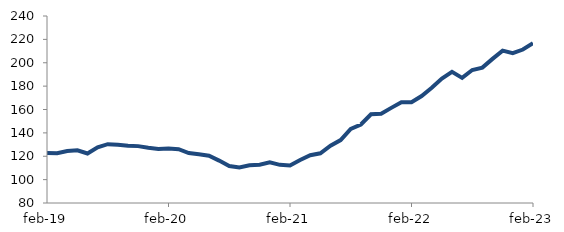
| Category | Series 0 |
|---|---|
| 2019-02-01 | 122.792 |
| 2019-03-01 | 122.605 |
| 2019-04-01 | 124.541 |
| 2019-05-01 | 125.115 |
| 2019-06-01 | 122.365 |
| 2019-07-01 | 127.653 |
| 2019-08-01 | 130.323 |
| 2019-09-01 | 129.814 |
| 2019-10-01 | 129.013 |
| 2019-11-01 | 128.663 |
| 2019-12-01 | 127.192 |
| 2020-01-01 | 126.144 |
| 2020-02-01 | 126.638 |
| 2020-03-01 | 125.992 |
| 2020-04-01 | 122.726 |
| 2020-05-01 | 121.669 |
| 2020-06-01 | 120.485 |
| 2020-07-01 | 116.268 |
| 2020-08-01 | 111.597 |
| 2020-09-01 | 110.39 |
| 2020-10-01 | 112.229 |
| 2020-11-01 | 112.769 |
| 2020-12-01 | 114.741 |
| 2021-01-01 | 112.625 |
| 2021-02-01 | 112.14 |
| 2021-03-01 | 116.74 |
| 2021-04-01 | 120.911 |
| 2021-05-01 | 122.536 |
| 2021-06-01 | 128.968 |
| 2021-07-01 | 133.864 |
| 2021-08-01 | 143.384 |
| 2021-09-01 | 147.196 |
| 2021-10-01 | 155.883 |
| 2021-11-01 | 156.426 |
| 2021-12-01 | 161.4 |
| 2022-01-01 | 166.276 |
| 2022-02-01 | 166.219 |
| 2022-03-01 | 171.531 |
| 2022-04-01 | 178.644 |
| 2022-05-01 | 186.465 |
| 2022-06-01 | 192.187 |
| 2022-07-01 | 187.044 |
| 2022-08-01 | 193.806 |
| 2022-09-01 | 195.846 |
| 2022-10-01 | 203.287 |
| 2022-11-01 | 210.344 |
| 2022-12-01 | 208.16 |
| 2023-01-01 | 211.29 |
| 2023-02-01 | 216.772 |